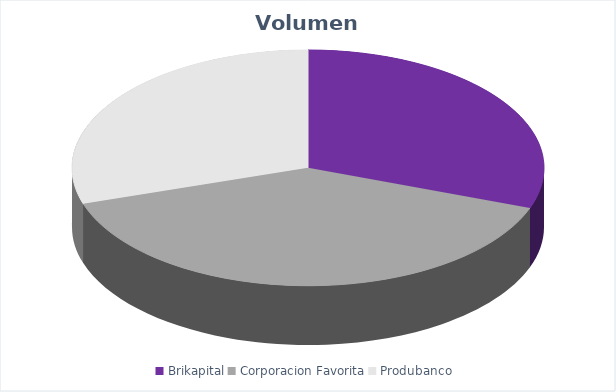
| Category | VOLUMEN ($USD) |
|---|---|
| Brikapital | 166000 |
| Corporacion Favorita | 214932.6 |
| Produbanco | 162720.6 |